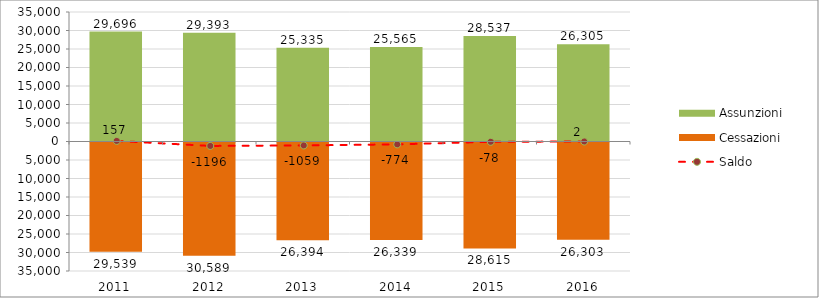
| Category | Assunzioni | Cessazioni |
|---|---|---|
| 2011.0 | 29696 | -29539 |
| 2012.0 | 29393 | -30589 |
| 2013.0 | 25335 | -26394 |
| 2014.0 | 25565 | -26339 |
| 2015.0 | 28537 | -28615 |
| 2016.0 | 26305 | -26303 |